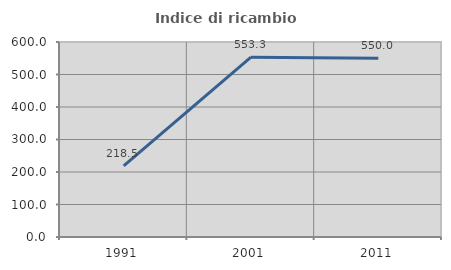
| Category | Indice di ricambio occupazionale  |
|---|---|
| 1991.0 | 218.519 |
| 2001.0 | 553.333 |
| 2011.0 | 550 |